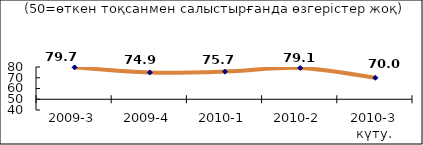
| Category | Диф.индекс ↓ |
|---|---|
| 2009-3 | 79.66 |
| 2009-4 | 74.905 |
| 2010-1 | 75.725 |
| 2010-2 | 79.11 |
| 2010-3 күту. | 70 |